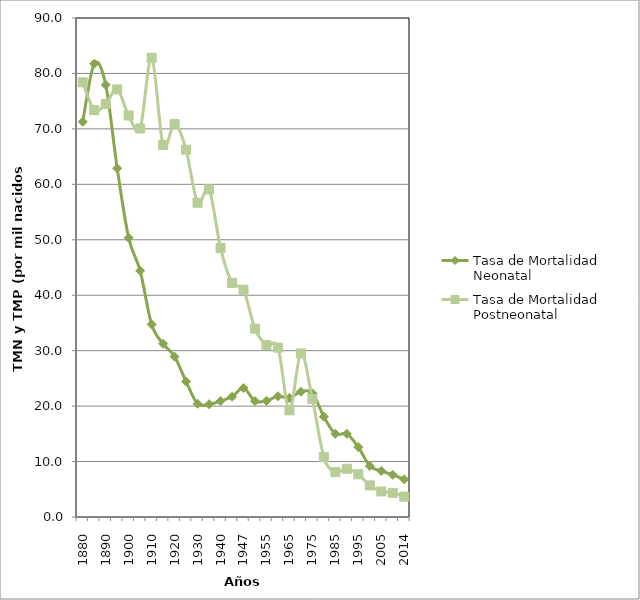
| Category | Tasa de Mortalidad Neonatal | Tasa de Mortalidad Postneonatal |
|---|---|---|
| 1880.0 | 71.289 | 78.399 |
| 1885.0 | 81.75 | 73.399 |
| 1890.0 | 77.94 | 74.513 |
| 1895.0 | 62.896 | 77.121 |
| 1900.0 | 50.347 | 72.409 |
| 1905.0 | 44.411 | 70.065 |
| 1910.0 | 34.738 | 82.833 |
| 1915.0 | 31.239 | 67.103 |
| 1920.0 | 28.924 | 70.884 |
| 1925.0 | 24.435 | 66.242 |
| 1930.0 | 20.418 | 56.674 |
| 1935.0 | 20.337 | 59.091 |
| 1940.0 | 20.914 | 48.523 |
| 1945.0 | 21.691 | 42.226 |
| 1947.0 | 23.247 | 40.979 |
| 1950.0 | 20.915 | 33.975 |
| 1955.0 | 20.951 | 30.987 |
| 1960.0 | 21.78 | 30.55 |
| 1965.0 | 21.46 | 19.236 |
| 1970.0 | 22.6 | 29.5 |
| 1975.0 | 22.3 | 21.3 |
| 1980.0 | 18.1 | 10.8 |
| 1985.0 | 15 | 8.1 |
| 1990.0 | 15 | 8.7 |
| 1995.0 | 12.6 | 7.7 |
| 2000.0 | 9.2 | 5.7 |
| 2005.0 | 8.3 | 4.6 |
| 2010.0 | 7.608 | 4.35 |
| 2014.0 | 6.787 | 3.665 |